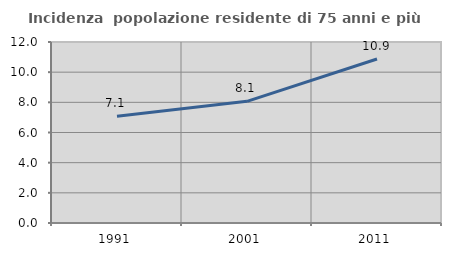
| Category | Incidenza  popolazione residente di 75 anni e più |
|---|---|
| 1991.0 | 7.083 |
| 2001.0 | 8.067 |
| 2011.0 | 10.872 |